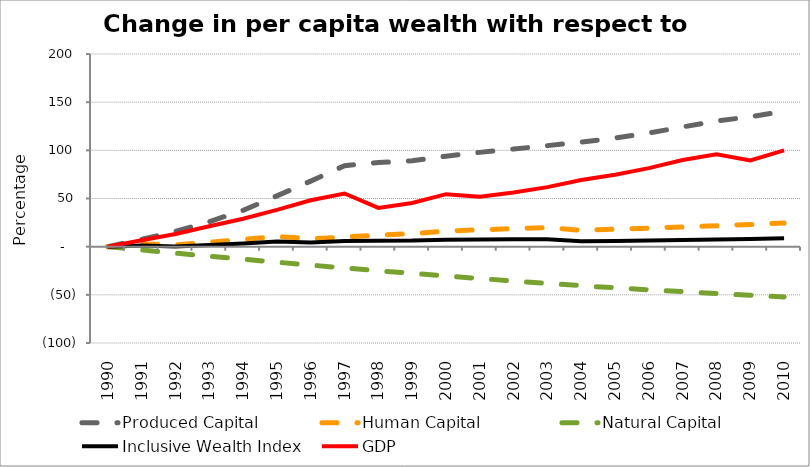
| Category | Produced Capital  | Human Capital | Natural Capital | Inclusive Wealth Index | GDP |
|---|---|---|---|---|---|
| 1990.0 | 0 | 0 | 0 | 0 | 0 |
| 1991.0 | 7.558 | 2.842 | -3.45 | 1.106 | 6.622 |
| 1992.0 | 15.854 | 1.918 | -6.749 | 0.22 | 13.095 |
| 1993.0 | 25.943 | 4.686 | -9.897 | 1.625 | 21.15 |
| 1994.0 | 37.737 | 7.547 | -13.028 | 3.246 | 29.009 |
| 1995.0 | 52.714 | 10.547 | -16.104 | 5.261 | 38.165 |
| 1996.0 | 68.065 | 8.219 | -19.131 | 4.339 | 48.22 |
| 1997.0 | 84.102 | 10.016 | -22.095 | 5.817 | 55.171 |
| 1998.0 | 87.324 | 11.922 | -24.981 | 6.189 | 40.268 |
| 1999.0 | 89.109 | 13.5 | -27.735 | 6.288 | 45.327 |
| 2000.0 | 93.96 | 16.15 | -30.391 | 7.309 | 54.505 |
| 2001.0 | 97.87 | 17.478 | -33.061 | 7.495 | 51.742 |
| 2002.0 | 101.361 | 18.726 | -35.637 | 7.629 | 56.33 |
| 2003.0 | 104.871 | 19.885 | -38.137 | 7.742 | 61.783 |
| 2004.0 | 108.59 | 16.953 | -40.522 | 5.619 | 69.178 |
| 2005.0 | 112.792 | 18.146 | -42.719 | 5.92 | 74.718 |
| 2006.0 | 117.92 | 19.271 | -44.783 | 6.316 | 81.556 |
| 2007.0 | 124.283 | 20.46 | -46.742 | 6.898 | 89.999 |
| 2008.0 | 130.36 | 21.724 | -48.631 | 7.521 | 95.869 |
| 2009.0 | 134.87 | 23.033 | -50.434 | 8.052 | 89.581 |
| 2010.0 | 140.545 | 24.564 | -52.184 | 8.835 | 99.988 |